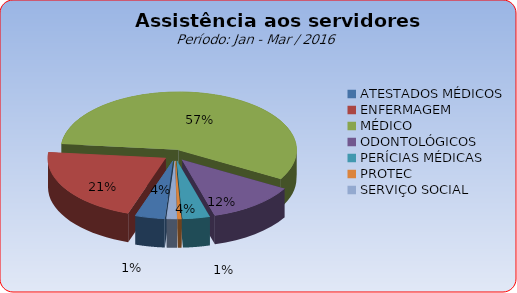
| Category | Series 0 |
|---|---|
| ATESTADOS MÉDICOS | 4.058 |
| ENFERMAGEM | 21.433 |
| MÉDICO | 56.69 |
| ODONTOLÓGICOS | 12.238 |
| PERÍCIAS MÉDICAS | 3.678 |
| PROTEC | 0.507 |
| SERVIÇO SOCIAL | 1.395 |